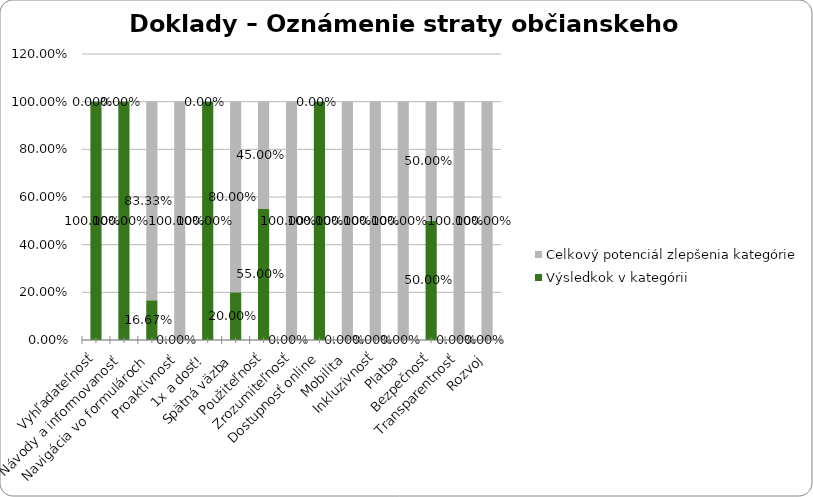
| Category | Výsledkok v kategórii | Celkový potenciál zlepšenia kategórie |
|---|---|---|
| Vyhľadateľnosť | 1 | 0 |
| Návody a informovanosť | 1 | 0 |
| Navigácia vo formulároch | 0.167 | 0.833 |
| Proaktívnosť | 0 | 1 |
| 1x a dosť! | 1 | 0 |
| Spätná väzba | 0.2 | 0.8 |
| Použiteľnosť | 0.55 | 0.45 |
| Zrozumiteľnosť | 0 | 1 |
| Dostupnosť online | 1 | 0 |
| Mobilita | 0 | 1 |
| Inkluzívnosť | 0 | 1 |
| Platba | 0 | 1 |
| Bezpečnosť | 0.5 | 0.5 |
| Transparentnosť | 0 | 1 |
| Rozvoj | 0 | 1 |